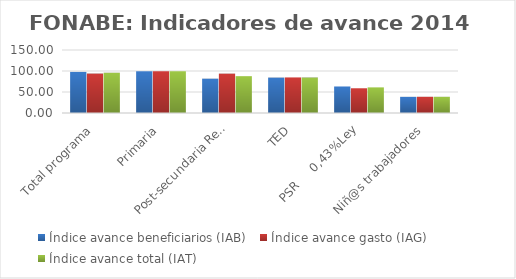
| Category | Índice avance beneficiarios (IAB)  | Índice avance gasto (IAG) | Índice avance total (IAT)  |
|---|---|---|---|
| Total programa | 97.831 | 93.881 | 95.856 |
| Primaria | 99.372 | 99.399 | 99.386 |
| Post-secundaria Regular | 81.688 | 93.719 | 87.703 |
| TED | 84.26 | 84.701 | 84.48 |
| PSR     0,43%Ley | 63.152 | 58.892 | 61.022 |
| Niñ@s trabajadores | 38.485 | 38.636 | 38.561 |